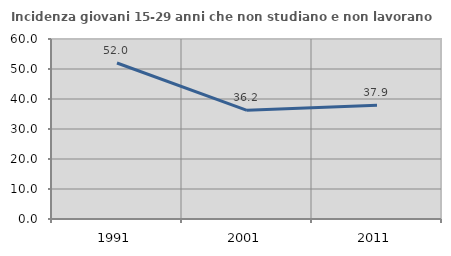
| Category | Incidenza giovani 15-29 anni che non studiano e non lavorano  |
|---|---|
| 1991.0 | 52.006 |
| 2001.0 | 36.232 |
| 2011.0 | 37.931 |